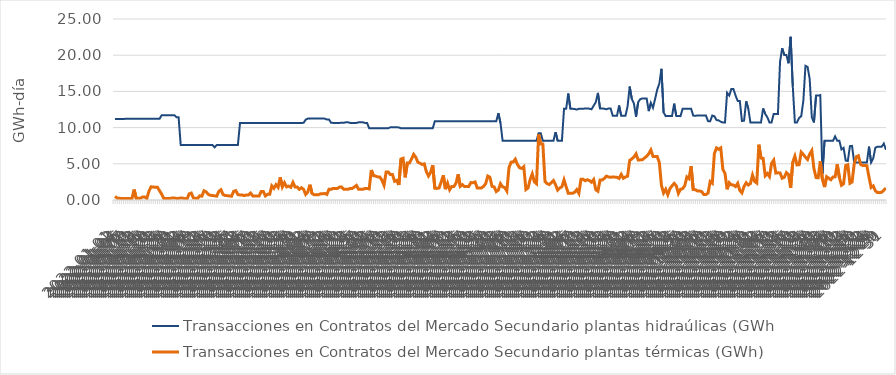
| Category | Transacciones en Contratos del Mercado Secundario plantas hidraúlicas (GWh) | Transacciones en Contratos del Mercado Secundario plantas térmicas (GWh) |
|---|---|---|
| 2022-01-01 | 11.196 | 0.516 |
| 2022-01-02 | 11.196 | 0.246 |
| 2022-01-03 | 11.196 | 0.246 |
| 2022-01-04 | 11.196 | 0.206 |
| 2022-01-05 | 11.196 | 0.206 |
| 2022-01-06 | 11.212 | 0.206 |
| 2022-01-07 | 11.212 | 0.201 |
| 2022-01-08 | 11.212 | 0.201 |
| 2022-01-09 | 11.212 | 0.221 |
| 2022-01-10 | 11.212 | 1.441 |
| 2022-01-11 | 11.212 | 0.231 |
| 2022-01-12 | 11.212 | 0.231 |
| 2022-01-13 | 11.212 | 0.241 |
| 2022-01-14 | 11.212 | 0.427 |
| 2022-01-15 | 11.212 | 0.407 |
| 2022-01-16 | 11.212 | 0.221 |
| 2022-01-17 | 11.212 | 1.218 |
| 2022-01-18 | 11.212 | 1.821 |
| 2022-01-19 | 11.212 | 1.791 |
| 2022-01-20 | 11.212 | 1.761 |
| 2022-01-21 | 11.212 | 1.761 |
| 2022-01-22 | 11.212 | 1.284 |
| 2022-01-23 | 11.712 | 0.802 |
| 2022-01-24 | 11.712 | 0.221 |
| 2022-01-25 | 11.712 | 0.221 |
| 2022-01-26 | 11.712 | 0.221 |
| 2022-01-27 | 11.712 | 0.221 |
| 2022-01-28 | 11.712 | 0.271 |
| 2022-01-29 | 11.712 | 0.271 |
| 2022-01-30 | 11.443 | 0.221 |
| 2022-01-31 | 11.443 | 0.221 |
| 2022-02-01 | 7.595 | 0.28 |
| 2022-02-02 | 7.595 | 0.25 |
| 2022-02-03 | 7.595 | 0.2 |
| 2022-02-04 | 7.595 | 0.15 |
| 2022-02-05 | 7.595 | 0.849 |
| 2022-02-06 | 7.6 | 0.963 |
| 2022-02-07 | 7.6 | 0.27 |
| 2022-02-08 | 7.6 | 0.252 |
| 2022-02-09 | 7.6 | 0.225 |
| 2022-02-10 | 7.6 | 0.576 |
| 2022-02-11 | 7.6 | 0.531 |
| 2022-02-12 | 7.6 | 1.276 |
| 2022-02-13 | 7.6 | 1.132 |
| 2022-02-14 | 7.595 | 0.784 |
| 2022-02-15 | 7.595 | 0.648 |
| 2022-02-16 | 7.595 | 0.621 |
| 2022-02-17 | 7.275 | 0.576 |
| 2022-02-18 | 7.595 | 0.531 |
| 2022-02-19 | 7.595 | 1.196 |
| 2022-02-20 | 7.595 | 1.419 |
| 2022-02-21 | 7.6 | 0.757 |
| 2022-02-22 | 7.6 | 0.622 |
| 2022-02-23 | 7.6 | 0.598 |
| 2022-02-24 | 7.6 | 0.558 |
| 2022-02-25 | 7.6 | 0.517 |
| 2022-02-26 | 7.6 | 1.196 |
| 2022-02-27 | 7.6 | 1.296 |
| 2022-02-28 | 7.6 | 0.757 |
| 2022-03-01 | 10.639 | 0.7 |
| 2022-03-02 | 10.639 | 0.7 |
| 2022-03-03 | 10.639 | 0.608 |
| 2022-03-04 | 10.639 | 0.7 |
| 2022-03-05 | 10.639 | 0.7 |
| 2022-03-06 | 10.639 | 0.96 |
| 2022-03-07 | 10.639 | 0.565 |
| 2022-03-08 | 10.639 | 0.565 |
| 2022-03-09 | 10.639 | 0.565 |
| 2022-03-10 | 10.639 | 0.565 |
| 2022-03-11 | 10.639 | 1.17 |
| 2022-03-12 | 10.639 | 1.17 |
| 2022-03-13 | 10.639 | 0.565 |
| 2022-03-14 | 10.639 | 0.78 |
| 2022-03-15 | 10.639 | 0.78 |
| 2022-03-16 | 10.639 | 1.955 |
| 2022-03-17 | 10.639 | 1.612 |
| 2022-03-18 | 10.639 | 2.116 |
| 2022-03-19 | 10.639 | 1.752 |
| 2022-03-20 | 10.639 | 3.132 |
| 2022-03-21 | 10.639 | 1.795 |
| 2022-03-22 | 10.639 | 2.386 |
| 2022-03-23 | 10.639 | 1.818 |
| 2022-03-24 | 10.639 | 1.921 |
| 2022-03-25 | 10.639 | 1.752 |
| 2022-03-26 | 10.639 | 2.431 |
| 2022-03-27 | 10.639 | 1.795 |
| 2022-03-28 | 10.639 | 1.795 |
| 2022-03-29 | 10.639 | 1.477 |
| 2022-03-30 | 10.639 | 1.692 |
| 2022-03-31 | 10.659 | 1.477 |
| 2022-04-01 | 11.098 | 0.773 |
| 2022-04-02 | 11.248 | 1.096 |
| 2022-04-03 | 11.238 | 2.11 |
| 2022-04-04 | 11.268 | 0.908 |
| 2022-04-05 | 11.268 | 0.718 |
| 2022-04-06 | 11.268 | 0.718 |
| 2022-04-07 | 11.268 | 0.718 |
| 2022-04-08 | 11.268 | 0.853 |
| 2022-04-09 | 11.248 | 0.853 |
| 2022-04-10 | 11.238 | 0.908 |
| 2022-04-11 | 11.118 | 0.773 |
| 2022-04-12 | 11.118 | 1.468 |
| 2022-04-13 | 10.668 | 1.468 |
| 2022-04-14 | 10.648 | 1.603 |
| 2022-04-15 | 10.648 | 1.603 |
| 2022-04-16 | 10.648 | 1.603 |
| 2022-04-17 | 10.648 | 1.795 |
| 2022-04-18 | 10.668 | 1.795 |
| 2022-04-19 | 10.668 | 1.468 |
| 2022-04-20 | 10.728 | 1.468 |
| 2022-04-21 | 10.728 | 1.468 |
| 2022-04-22 | 10.648 | 1.603 |
| 2022-04-23 | 10.648 | 1.603 |
| 2022-04-24 | 10.648 | 1.795 |
| 2022-04-25 | 10.648 | 2.015 |
| 2022-04-26 | 10.728 | 1.468 |
| 2022-04-27 | 10.728 | 1.468 |
| 2022-04-28 | 10.728 | 1.468 |
| 2022-04-29 | 10.648 | 1.603 |
| 2022-04-30 | 10.648 | 1.603 |
| 2022-05-01 | 9.902 | 1.524 |
| 2022-05-02 | 9.902 | 4.144 |
| 2022-05-03 | 9.902 | 3.364 |
| 2022-05-04 | 9.902 | 3.303 |
| 2022-05-05 | 9.902 | 3.196 |
| 2022-05-06 | 9.902 | 3.182 |
| 2022-05-07 | 9.902 | 2.749 |
| 2022-05-08 | 9.902 | 2.042 |
| 2022-05-09 | 9.902 | 3.875 |
| 2022-05-10 | 9.902 | 3.864 |
| 2022-05-11 | 10.047 | 3.506 |
| 2022-05-12 | 10.047 | 3.506 |
| 2022-05-13 | 10.047 | 2.579 |
| 2022-05-14 | 10.039 | 2.708 |
| 2022-05-15 | 10.026 | 2.071 |
| 2022-05-16 | 9.902 | 5.656 |
| 2022-05-17 | 9.902 | 5.763 |
| 2022-05-18 | 9.902 | 3.131 |
| 2022-05-19 | 9.902 | 5.123 |
| 2022-05-20 | 9.902 | 5.111 |
| 2022-05-21 | 9.902 | 5.672 |
| 2022-05-22 | 9.902 | 6.304 |
| 2022-05-23 | 9.902 | 5.891 |
| 2022-05-24 | 9.902 | 5.21 |
| 2022-05-25 | 9.902 | 5.08 |
| 2022-05-26 | 9.902 | 4.911 |
| 2022-05-27 | 9.902 | 4.993 |
| 2022-05-28 | 9.902 | 3.907 |
| 2022-05-29 | 9.902 | 3.314 |
| 2022-05-30 | 9.902 | 3.82 |
| 2022-05-31 | 9.902 | 4.815 |
| 2022-06-01 | 10.88 | 1.619 |
| 2022-06-02 | 10.88 | 1.6 |
| 2022-06-03 | 10.88 | 1.665 |
| 2022-06-04 | 10.88 | 2.483 |
| 2022-06-05 | 10.88 | 3.407 |
| 2022-06-06 | 10.88 | 1.498 |
| 2022-06-07 | 10.88 | 2.324 |
| 2022-06-08 | 10.88 | 1.411 |
| 2022-06-09 | 10.88 | 1.873 |
| 2022-06-10 | 10.88 | 1.86 |
| 2022-06-11 | 10.88 | 2.329 |
| 2022-06-12 | 10.88 | 3.546 |
| 2022-06-13 | 10.88 | 1.887 |
| 2022-06-14 | 10.88 | 2.115 |
| 2022-06-15 | 10.88 | 1.851 |
| 2022-06-16 | 10.88 | 1.863 |
| 2022-06-17 | 10.88 | 1.863 |
| 2022-06-18 | 10.88 | 2.402 |
| 2022-06-19 | 10.88 | 2.385 |
| 2022-06-20 | 10.88 | 2.493 |
| 2022-06-21 | 10.88 | 1.671 |
| 2022-06-22 | 10.88 | 1.671 |
| 2022-06-23 | 10.88 | 1.671 |
| 2022-06-24 | 10.88 | 1.877 |
| 2022-06-25 | 10.88 | 2.25 |
| 2022-06-26 | 10.88 | 3.307 |
| 2022-06-27 | 10.88 | 3.149 |
| 2022-06-28 | 10.88 | 1.882 |
| 2022-06-29 | 10.88 | 1.811 |
| 2022-06-30 | 10.88 | 1.169 |
| 2022-07-01 | 11.985 | 1.372 |
| 2022-07-02 | 10.629 | 2.254 |
| 2022-07-03 | 8.176 | 1.824 |
| 2022-07-04 | 8.176 | 1.707 |
| 2022-07-05 | 8.176 | 1.239 |
| 2022-07-06 | 8.176 | 4.445 |
| 2022-07-07 | 8.176 | 5.231 |
| 2022-07-08 | 8.176 | 5.241 |
| 2022-07-09 | 8.176 | 5.64 |
| 2022-07-10 | 8.176 | 4.904 |
| 2022-07-11 | 8.176 | 4.455 |
| 2022-07-12 | 8.176 | 4.356 |
| 2022-07-13 | 8.176 | 4.6 |
| 2022-07-14 | 8.176 | 1.442 |
| 2022-07-15 | 8.176 | 1.664 |
| 2022-07-16 | 8.176 | 2.826 |
| 2022-07-17 | 8.176 | 3.608 |
| 2022-07-18 | 8.176 | 2.506 |
| 2022-07-19 | 8.176 | 2.251 |
| 2022-07-20 | 9.23 | 9.048 |
| 2022-07-21 | 9.23 | 7.724 |
| 2022-07-22 | 8.176 | 7.724 |
| 2022-07-23 | 8.176 | 2.556 |
| 2022-07-24 | 8.176 | 2.267 |
| 2022-07-25 | 8.176 | 2.131 |
| 2022-07-26 | 8.176 | 2.4 |
| 2022-07-27 | 8.176 | 2.682 |
| 2022-07-28 | 9.376 | 2.104 |
| 2022-07-29 | 8.176 | 1.362 |
| 2022-07-30 | 8.176 | 1.653 |
| 2022-07-31 | 8.176 | 1.837 |
| 2022-08-01 | 12.599 | 2.79 |
| 2022-08-02 | 12.599 | 1.821 |
| 2022-08-03 | 14.707 | 0.918 |
| 2022-08-04 | 12.599 | 0.918 |
| 2022-08-05 | 12.599 | 0.918 |
| 2022-08-06 | 12.568 | 1.071 |
| 2022-08-07 | 12.487 | 1.439 |
| 2022-08-08 | 12.599 | 0.918 |
| 2022-08-09 | 12.599 | 2.862 |
| 2022-08-10 | 12.599 | 2.862 |
| 2022-08-11 | 12.644 | 2.663 |
| 2022-08-12 | 12.644 | 2.8 |
| 2022-08-13 | 12.613 | 2.679 |
| 2022-08-14 | 12.532 | 2.446 |
| 2022-08-15 | 13.032 | 2.822 |
| 2022-08-16 | 13.504 | 1.41 |
| 2022-08-17 | 14.792 | 1.21 |
| 2022-08-18 | 12.644 | 2.751 |
| 2022-08-19 | 12.644 | 2.762 |
| 2022-08-20 | 12.613 | 2.979 |
| 2022-08-21 | 12.532 | 3.293 |
| 2022-08-22 | 12.644 | 3.184 |
| 2022-08-23 | 12.644 | 3.142 |
| 2022-08-24 | 11.624 | 3.184 |
| 2022-08-25 | 11.624 | 3.157 |
| 2022-08-26 | 11.624 | 3.129 |
| 2022-08-27 | 13.052 | 2.979 |
| 2022-08-28 | 11.624 | 3.547 |
| 2022-08-29 | 11.624 | 3 |
| 2022-08-30 | 11.624 | 3.177 |
| 2022-08-31 | 12.924 | 3.291 |
| 2022-09-01 | 15.665 | 5.474 |
| 2022-09-02 | 13.96 | 5.668 |
| 2022-09-03 | 13.327 | 5.941 |
| 2022-09-04 | 11.5 | 6.382 |
| 2022-09-05 | 13.513 | 5.539 |
| 2022-09-06 | 13.928 | 5.539 |
| 2022-09-07 | 14.033 | 5.563 |
| 2022-09-08 | 14.033 | 5.803 |
| 2022-09-09 | 14.033 | 6.037 |
| 2022-09-10 | 12.278 | 6.385 |
| 2022-09-11 | 13.42 | 6.91 |
| 2022-09-12 | 12.74 | 6.021 |
| 2022-09-13 | 13.953 | 6.021 |
| 2022-09-14 | 15.239 | 6.009 |
| 2022-09-15 | 16.088 | 5.16 |
| 2022-09-16 | 18.116 | 2 |
| 2022-09-17 | 12.107 | 0.97 |
| 2022-09-18 | 11.584 | 1.477 |
| 2022-09-19 | 11.61 | 0.725 |
| 2022-09-20 | 11.61 | 1.568 |
| 2022-09-21 | 11.61 | 1.955 |
| 2022-09-22 | 13.302 | 2.295 |
| 2022-09-23 | 11.61 | 1.962 |
| 2022-09-24 | 11.602 | 0.907 |
| 2022-09-25 | 11.584 | 1.477 |
| 2022-09-26 | 12.602 | 1.567 |
| 2022-09-27 | 12.602 | 1.974 |
| 2022-09-28 | 12.602 | 3.187 |
| 2022-09-29 | 12.602 | 2.95 |
| 2022-09-30 | 12.602 | 4.663 |
| 2022-10-01 | 11.657 | 1.44 |
| 2022-10-02 | 11.639 | 1.424 |
| 2022-10-03 | 11.665 | 1.254 |
| 2022-10-04 | 11.665 | 1.254 |
| 2022-10-05 | 11.665 | 1.158 |
| 2022-10-06 | 11.665 | 0.761 |
| 2022-10-07 | 11.665 | 0.761 |
| 2022-10-08 | 10.891 | 0.954 |
| 2022-10-09 | 10.874 | 2.549 |
| 2022-10-10 | 11.665 | 2.313 |
| 2022-10-11 | 11.565 | 6.427 |
| 2022-10-12 | 11.04 | 7.192 |
| 2022-10-13 | 11 | 7.001 |
| 2022-10-14 | 10.809 | 7.192 |
| 2022-10-15 | 10.709 | 4.239 |
| 2022-10-16 | 10.709 | 3.67 |
| 2022-10-17 | 14.815 | 1.481 |
| 2022-10-18 | 14.426 | 2.396 |
| 2022-10-19 | 15.316 | 2.103 |
| 2022-10-20 | 15.316 | 2.062 |
| 2022-10-21 | 14.426 | 1.855 |
| 2022-10-22 | 13.685 | 2.306 |
| 2022-10-23 | 13.685 | 1.32 |
| 2022-10-24 | 10.909 | 0.981 |
| 2022-10-25 | 10.959 | 1.878 |
| 2022-10-26 | 13.633 | 2.38 |
| 2022-10-27 | 12.633 | 2.072 |
| 2022-10-28 | 10.709 | 2.26 |
| 2022-10-29 | 10.709 | 3.447 |
| 2022-10-30 | 10.709 | 2.563 |
| 2022-10-31 | 10.709 | 2.347 |
| 2022-11-01 | 10.714 | 7.639 |
| 2022-11-02 | 10.714 | 5.786 |
| 2022-11-03 | 12.637 | 5.751 |
| 2022-11-04 | 11.887 | 3.353 |
| 2022-11-05 | 11.427 | 3.661 |
| 2022-11-06 | 10.714 | 3.23 |
| 2022-11-07 | 10.714 | 5.068 |
| 2022-11-08 | 11.887 | 5.506 |
| 2022-11-09 | 11.887 | 3.714 |
| 2022-11-10 | 11.887 | 3.755 |
| 2022-11-11 | 19.087 | 3.736 |
| 2022-11-12 | 20.96 | 3.004 |
| 2022-11-13 | 20.027 | 3.134 |
| 2022-11-14 | 20.027 | 3.786 |
| 2022-11-15 | 18.883 | 3.52 |
| 2022-11-16 | 22.537 | 1.668 |
| 2022-11-17 | 15.757 | 5.216 |
| 2022-11-18 | 10.714 | 6.048 |
| 2022-11-19 | 10.714 | 4.843 |
| 2022-11-20 | 11.34 | 4.879 |
| 2022-11-21 | 11.563 | 6.609 |
| 2022-11-22 | 13.706 | 6.286 |
| 2022-11-23 | 18.529 | 5.896 |
| 2022-11-24 | 18.379 | 5.597 |
| 2022-11-25 | 16.697 | 6.349 |
| 2022-11-26 | 11.427 | 6.83 |
| 2022-11-27 | 10.714 | 4.327 |
| 2022-11-28 | 14.417 | 3.096 |
| 2022-11-29 | 14.417 | 3.076 |
| 2022-11-30 | 14.497 | 5.328 |
| 2022-12-01 | 3.644 | 2.843 |
| 2022-12-02 | 8.188 | 1.787 |
| 2022-12-03 | 8.188 | 3.217 |
| 2022-12-04 | 8.188 | 3.014 |
| 2022-12-05 | 8.188 | 2.795 |
| 2022-12-06 | 8.188 | 3.174 |
| 2022-12-07 | 8.788 | 3.204 |
| 2022-12-08 | 8.188 | 4.926 |
| 2022-12-09 | 8.188 | 3.126 |
| 2022-12-10 | 6.986 | 2.029 |
| 2022-12-11 | 7.203 | 2.241 |
| 2022-12-12 | 5.446 | 4.768 |
| 2022-12-13 | 5.391 | 4.865 |
| 2022-12-14 | 7.442 | 2.308 |
| 2022-12-15 | 7.468 | 2.485 |
| 2022-12-16 | 5.188 | 4.925 |
| 2022-12-17 | 5.188 | 5.977 |
| 2022-12-18 | 5.188 | 6.111 |
| 2022-12-19 | 5.188 | 4.94 |
| 2022-12-20 | 5.188 | 4.766 |
| 2022-12-21 | 5.188 | 4.767 |
| 2022-12-22 | 5.188 | 4.743 |
| 2022-12-23 | 7.367 | 3.155 |
| 2022-12-24 | 5.188 | 1.733 |
| 2022-12-25 | 5.767 | 1.951 |
| 2022-12-26 | 7.222 | 1.267 |
| 2022-12-27 | 7.367 | 1.021 |
| 2022-12-28 | 7.367 | 1.018 |
| 2022-12-29 | 7.367 | 1.08 |
| 2022-12-30 | 7.791 | 1.346 |
| 2022-12-31 | 6.935 | 1.647 |